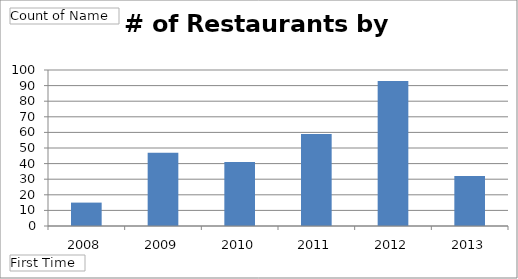
| Category | Total |
|---|---|
| 2008 | 15 |
| 2009 | 47 |
| 2010 | 41 |
| 2011 | 59 |
| 2012 | 93 |
| 2013 | 32 |